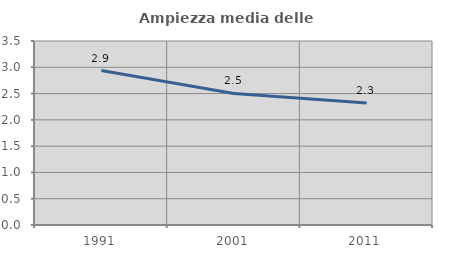
| Category | Ampiezza media delle famiglie |
|---|---|
| 1991.0 | 2.937 |
| 2001.0 | 2.502 |
| 2011.0 | 2.321 |